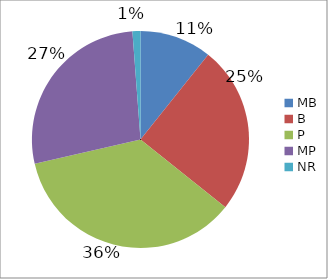
| Category | Series 0 |
|---|---|
| MB | 0.107 |
| B | 0.25 |
| P | 0.357 |
| MP | 0.274 |
| NR | 0.012 |